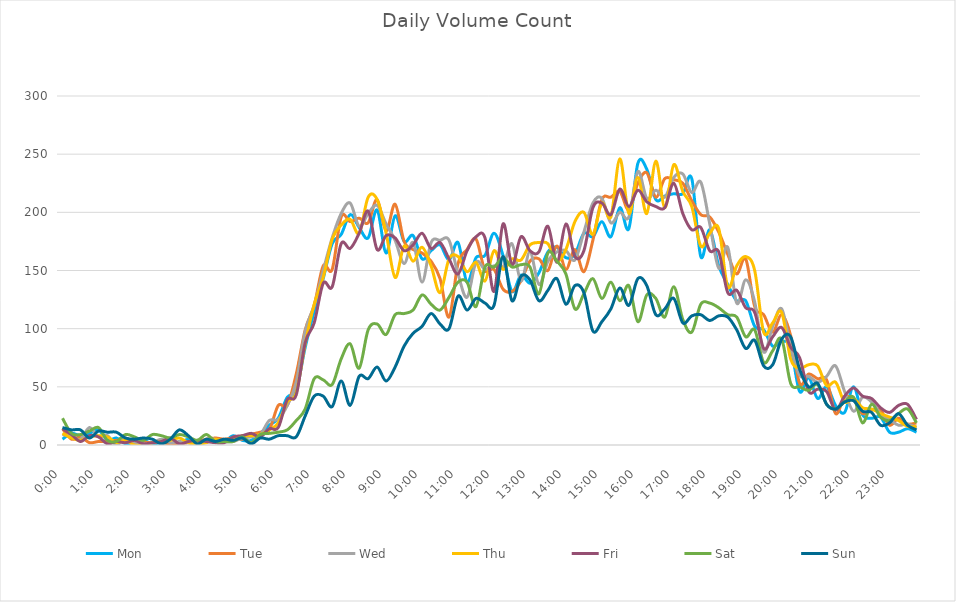
| Category | Mon | Tue | Wed | Thu | Fri | Sat | Sun |
|---|---|---|---|---|---|---|---|
| 0.0 | 5 | 14 | 9 | 10 | 14 | 23 | 15 |
| 0.010416666666666666 | 10 | 5 | 7 | 6 | 9 | 10 | 13 |
| 0.020833333333333332 | 8 | 7 | 5 | 4 | 3 | 9 | 13 |
| 0.03125 | 10 | 2 | 15 | 7 | 8 | 12 | 6 |
| 0.041666666666666664 | 13 | 3 | 7 | 8 | 7 | 15 | 12 |
| 0.05208333333333333 | 4 | 3 | 8 | 7 | 1 | 4 | 11 |
| 0.06249999999999999 | 6 | 4 | 0 | 2 | 3 | 3 | 11 |
| 0.07291666666666666 | 1 | 4 | 6 | 4 | 2 | 9 | 6 |
| 0.08333333333333333 | 1 | 1 | 2 | 0 | 4 | 7 | 5 |
| 0.09375 | 4 | 2 | 1 | 0 | 1 | 4 | 6 |
| 0.10416666666666667 | 1 | 2 | 2 | 2 | 2 | 9 | 5 |
| 0.11458333333333334 | 2 | 2 | 5 | 3 | 3 | 8 | 1 |
| 0.125 | 1 | 1 | 2 | 4 | 6 | 6 | 5 |
| 0.13541666666666666 | 1 | 1 | 3 | 6 | 1 | 9 | 13 |
| 0.14583333333333331 | 5 | 2 | 2 | 2 | 3 | 7 | 8 |
| 0.15624999999999997 | 0 | 3 | 0 | 1 | 4 | 4 | 1 |
| 0.16666666666666663 | 3 | 5 | 5 | 2 | 3 | 9 | 5 |
| 0.1770833333333333 | 5 | 6 | 5 | 5 | 2 | 3 | 3 |
| 0.18749999999999994 | 3 | 5 | 3 | 3 | 2 | 3 | 5 |
| 0.1979166666666666 | 8 | 6 | 3 | 4 | 7 | 3 | 4 |
| 0.20833333333333326 | 4 | 5 | 6 | 8 | 8 | 7 | 6 |
| 0.21874999999999992 | 4 | 9 | 7 | 8 | 10 | 2 | 1 |
| 0.22916666666666657 | 10 | 11 | 9 | 9 | 7 | 9 | 6 |
| 0.23958333333333323 | 17 | 13 | 21 | 13 | 14 | 10 | 5 |
| 0.2499999999999999 | 23 | 34 | 22 | 19 | 15 | 11 | 8 |
| 0.2604166666666666 | 41 | 34 | 34 | 37 | 39 | 13 | 8 |
| 0.27083333333333326 | 47 | 61 | 54 | 45 | 43 | 21 | 7 |
| 0.28124999999999994 | 84 | 99 | 98 | 87 | 88 | 31 | 25 |
| 0.29166666666666663 | 115 | 120 | 120 | 121 | 105 | 57 | 42 |
| 0.3020833333333333 | 143 | 154 | 150 | 144 | 139 | 56 | 42 |
| 0.3125 | 173 | 151 | 178 | 177 | 136 | 52 | 33 |
| 0.3229166666666667 | 181 | 196 | 199 | 189 | 173 | 74 | 55 |
| 0.33333333333333337 | 198 | 192 | 208 | 194 | 169 | 87 | 34 |
| 0.34375000000000006 | 187 | 195 | 188 | 182 | 182 | 66 | 59 |
| 0.35416666666666674 | 178 | 191 | 199 | 213 | 201 | 99 | 57 |
| 0.3645833333333334 | 202 | 211 | 206 | 211 | 168 | 104 | 67 |
| 0.3750000000000001 | 165 | 184 | 190 | 182 | 180 | 95 | 55 |
| 0.3854166666666668 | 197 | 207 | 176 | 144 | 178 | 112 | 67 |
| 0.3958333333333335 | 175 | 175 | 156 | 171 | 167 | 113 | 85 |
| 0.40625000000000017 | 180 | 168 | 174 | 158 | 172 | 116 | 96 |
| 0.41666666666666685 | 160 | 165 | 140 | 170 | 182 | 129 | 102 |
| 0.4270833333333333 | 167 | 158 | 174 | 154 | 169 | 121 | 113 |
| 0.4375000000000002 | 172 | 143 | 176 | 131 | 174 | 116 | 104 |
| 0.4479166666666669 | 159 | 110 | 176 | 160 | 160 | 127 | 100 |
| 0.4583333333333333 | 174 | 156 | 147 | 162 | 147 | 140 | 128 |
| 0.4687500000000003 | 140 | 168 | 127 | 149 | 167 | 140 | 116 |
| 0.47916666666666696 | 161 | 177 | 157 | 157 | 179 | 119 | 126 |
| 0.4895833333333333 | 163 | 150 | 151 | 141 | 178 | 153 | 122 |
| 0.5000000000000003 | 182 | 151 | 154 | 167 | 132 | 153 | 120 |
| 0.510416666666667 | 163 | 134 | 153 | 151 | 190 | 161 | 162 |
| 0.5208333333333334 | 132 | 132 | 173 | 160 | 155 | 153 | 124 |
| 0.5312500000000002 | 146 | 141 | 141 | 159 | 179 | 155 | 145 |
| 0.5416666666666669 | 139 | 158 | 166 | 172 | 167 | 153 | 142 |
| 0.5520833333333335 | 148 | 160 | 138 | 174 | 166 | 130 | 124 |
| 0.5625000000000001 | 166 | 150 | 158 | 173 | 188 | 165 | 133 |
| 0.5729166666666667 | 170 | 171 | 166 | 158 | 157 | 158 | 143 |
| 0.5833333333333334 | 161 | 151 | 167 | 168 | 190 | 147 | 121 |
| 0.59375 | 164 | 168 | 159 | 192 | 162 | 117 | 137 |
| 0.6041666666666666 | 182 | 149 | 183 | 200 | 167 | 130 | 131 |
| 0.6145833333333333 | 179 | 176 | 208 | 181 | 204 | 143 | 98 |
| 0.6249999999999999 | 192 | 211 | 212 | 208 | 208 | 126 | 106 |
| 0.6354166666666665 | 179 | 213 | 191 | 196 | 198 | 140 | 117 |
| 0.6458333333333331 | 204 | 218 | 200 | 246 | 220 | 124 | 135 |
| 0.6562499999999998 | 186 | 202 | 196 | 199 | 205 | 137 | 120 |
| 0.6666666666666666 | 242 | 225 | 235 | 230 | 219 | 106 | 143 |
| 0.677083333333333 | 237 | 234 | 212 | 199 | 209 | 129 | 137 |
| 0.6874999999999997 | 211 | 213 | 219 | 244 | 205 | 126 | 112 |
| 0.6979166666666666 | 214 | 229 | 213 | 204 | 204 | 110 | 117 |
| 0.7083333333333329 | 216 | 228 | 230 | 241 | 225 | 136 | 126 |
| 0.7187499999999996 | 216 | 225 | 233 | 218 | 199 | 108 | 105 |
| 0.7291666666666666 | 229 | 210 | 217 | 205 | 185 | 97 | 111 |
| 0.7395833333333328 | 162 | 198 | 226 | 171 | 187 | 121 | 112 |
| 0.75 | 185 | 196 | 190 | 182 | 167 | 122 | 107 |
| 0.7604166666666666 | 154 | 183 | 152 | 186 | 166 | 118 | 111 |
| 0.7708333333333327 | 138 | 164 | 170 | 136 | 131 | 112 | 110 |
| 0.78125 | 124 | 147 | 122 | 154 | 133 | 110 | 99 |
| 0.7916666666666666 | 124 | 160 | 142 | 162 | 118 | 93 | 83 |
| 0.8020833333333326 | 102 | 119 | 123 | 150 | 114 | 99 | 90 |
| 0.8125 | 99 | 112 | 80 | 97 | 83 | 71 | 68 |
| 0.8229166666666666 | 85 | 97 | 102 | 105 | 93 | 81 | 69 |
| 0.8333333333333334 | 89 | 112 | 117 | 114 | 101 | 91 | 91 |
| 0.84375 | 84 | 94 | 84 | 74 | 84 | 53 | 93 |
| 0.8541666666666666 | 46 | 53 | 60 | 66 | 75 | 50 | 65 |
| 0.8645833333333334 | 58 | 61 | 59 | 69 | 46 | 47 | 50 |
| 0.875 | 40 | 57 | 54 | 68 | 48 | 52 | 53 |
| 0.8854166666666666 | 50 | 56 | 59 | 51 | 46 | 35 | 35 |
| 0.8958333333333334 | 34 | 27 | 68 | 54 | 30 | 31 | 31 |
| 0.90625 | 28 | 41 | 46 | 37 | 42 | 37 | 37 |
| 0.9166666666666666 | 50 | 39 | 29 | 40 | 49 | 41 | 38 |
| 0.9270833333333334 | 26 | 27 | 41 | 32 | 42 | 19 | 29 |
| 0.9375 | 23 | 30 | 37 | 31 | 40 | 35 | 28 |
| 0.9479166666666666 | 24 | 30 | 27 | 27 | 32 | 24 | 17 |
| 0.9583333333333334 | 11 | 17 | 22 | 24 | 28 | 21 | 19 |
| 0.96875 | 11 | 23 | 17 | 21 | 34 | 27 | 27 |
| 0.9791666666666666 | 14 | 18 | 18 | 16 | 35 | 31 | 17 |
| 0.9895833333333334 | 11 | 19 | 15 | 16 | 22 | 19 | 13 |